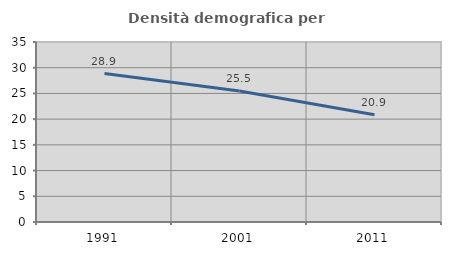
| Category | Densità demografica |
|---|---|
| 1991.0 | 28.859 |
| 2001.0 | 25.455 |
| 2011.0 | 20.852 |